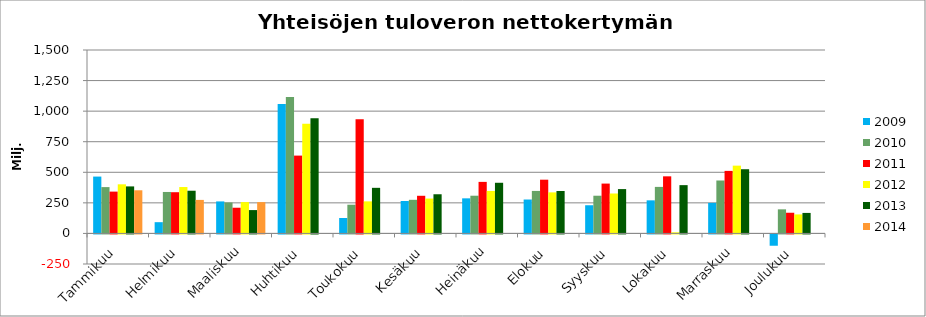
| Category | 2009 | 2010 | 2011 | 2012 | 2013 | 2014 |
|---|---|---|---|---|---|---|
| Tammikuu | 464.899 | 378.86 | 341.987 | 401.627 | 384.485 | 352.772 |
| Helmikuu | 92.021 | 339.045 | 337.078 | 379.401 | 349.199 | 274.106 |
| Maaliskuu | 261.783 | 253.057 | 210.203 | 256.28 | 190.945 | 256.156 |
| Huhtikuu | 1059.201 | 1115.624 | 636.437 | 897.203 | 940.935 | 0 |
| Toukokuu | 126.163 | 234.756 | 933.434 | 262.244 | 372.901 | 0 |
| Kesäkuu | 265.105 | 274.88 | 307.856 | 285.13 | 320.319 | 0 |
| Heinäkuu | 286.978 | 308.391 | 421.522 | 347.389 | 414.27 | 0 |
| Elokuu | 277.363 | 347.548 | 439.399 | 335.795 | 347.137 | 0 |
| Syyskuu | 230.468 | 308.333 | 407.65 | 326.578 | 362.569 | 0 |
| Lokakuu | 270.56 | 380.508 | 466.894 | 9.04 | 394.905 | 0 |
| Marraskuu | 249.968 | 432.891 | 511.438 | 554.296 | 524.993 | 0 |
| Joulukuu | -92.536 | 196.924 | 169.141 | 155.44 | 167.693 | 0 |